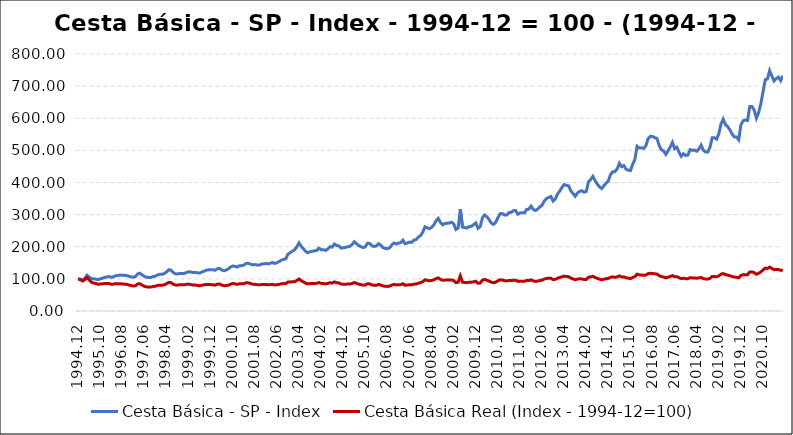
| Category | Cesta Básica - SP - Index | Cesta Básica Real (Index - 1994-12=100) |
|---|---|---|
| 1994.12 | 100 | 100 |
| 1995.01 | 99.302 | 97.642 |
| 1995.02 | 95.848 | 93.294 |
| 1995.03 | 101.418 | 97.21 |
| 1995.04 | 111.508 | 104.344 |
| 1995.05 | 105.937 | 96.554 |
| 1995.06 | 100.904 | 89.934 |
| 1995.07 | 100.149 | 87.203 |
| 1995.08 | 99.279 | 85.598 |
| 1995.09 | 97.529 | 83.265 |
| 1995.10 | 100.092 | 84.265 |
| 1995.11 | 101.853 | 84.505 |
| 1995.12 | 104.69 | 85.525 |
| 1996.01 | 105.891 | 85.362 |
| 1996.02 | 107.264 | 85.587 |
| 1996.03 | 104.839 | 83.36 |
| 1996.04 | 106.36 | 83.518 |
| 1996.05 | 110.021 | 85.351 |
| 1996.06 | 110.204 | 84.488 |
| 1996.07 | 112.091 | 84.991 |
| 1996.08 | 111.256 | 83.988 |
| 1996.09 | 110.89 | 83.587 |
| 1996.10 | 110.215 | 82.829 |
| 1996.11 | 108.167 | 81.031 |
| 1996.12 | 105.971 | 79.015 |
| 1997.01 | 105.445 | 77.705 |
| 1997.02 | 107.287 | 78.669 |
| 1997.03 | 115.671 | 84.387 |
| 1997.04 | 117.605 | 85.049 |
| 1997.05 | 111.771 | 80.5 |
| 1997.06 | 107.584 | 77.069 |
| 1997.07 | 104.896 | 74.978 |
| 1997.08 | 104.621 | 74.797 |
| 1997.09 | 104.255 | 74.49 |
| 1997.10 | 107.527 | 76.651 |
| 1997.11 | 108.453 | 77.181 |
| 1997.12 | 112.469 | 79.695 |
| 1998.01 | 114.402 | 80.494 |
| 1998.02 | 113.99 | 79.932 |
| 1998.03 | 116.644 | 81.516 |
| 1998.04 | 121.597 | 84.774 |
| 1998.05 | 128.277 | 88.987 |
| 1998.06 | 127.511 | 88.437 |
| 1998.07 | 120.201 | 83.468 |
| 1998.08 | 116.026 | 80.981 |
| 1998.09 | 114.997 | 80.44 |
| 1998.10 | 117.239 | 81.992 |
| 1998.11 | 116.404 | 81.506 |
| 1998.12 | 116.781 | 81.501 |
| 1999.01 | 119.95 | 83.13 |
| 1999.02 | 122.112 | 83.749 |
| 1999.03 | 121.574 | 82.473 |
| 1999.04 | 119.584 | 80.671 |
| 1999.05 | 120.167 | 80.822 |
| 1999.06 | 118.966 | 79.863 |
| 1999.07 | 117.856 | 78.265 |
| 1999.08 | 121.517 | 80.246 |
| 1999.09 | 123.736 | 81.459 |
| 1999.10 | 127.099 | 82.689 |
| 1999.11 | 128.014 | 82.501 |
| 1999.12 | 128.071 | 82.046 |
| 2000.01 | 128.369 | 81.729 |
| 2000.02 | 126.744 | 80.59 |
| 2000.03 | 131.698 | 83.556 |
| 2000.04 | 132.601 | 83.777 |
| 2000.05 | 127.865 | 80.777 |
| 2000.06 | 125.189 | 78.905 |
| 2000.07 | 127.465 | 79.067 |
| 2000.08 | 131.126 | 80.286 |
| 2000.09 | 136.662 | 83.483 |
| 2000.10 | 140.254 | 85.558 |
| 2000.11 | 139.11 | 84.589 |
| 2000.12 | 136.742 | 82.662 |
| 2001.01 | 141.112 | 84.82 |
| 2001.02 | 141.203 | 84.486 |
| 2001.03 | 142.713 | 85.066 |
| 2001.04 | 148.124 | 87.782 |
| 2001.05 | 148.456 | 87.62 |
| 2001.06 | 145.939 | 85.689 |
| 2001.07 | 143.766 | 83.305 |
| 2001.08 | 144.578 | 83.193 |
| 2001.09 | 142.999 | 82.055 |
| 2001.10 | 142.988 | 81.373 |
| 2001.11 | 145.596 | 82.273 |
| 2001.12 | 147.106 | 82.589 |
| 2002.01 | 147.804 | 82.552 |
| 2002.02 | 147.14 | 81.887 |
| 2002.03 | 148.582 | 82.195 |
| 2002.04 | 151.247 | 83.006 |
| 2002.05 | 147.861 | 80.978 |
| 2002.06 | 150.423 | 82.036 |
| 2002.07 | 154.015 | 83.007 |
| 2002.08 | 158.19 | 84.707 |
| 2002.09 | 160.661 | 85.415 |
| 2002.10 | 162.571 | 85.313 |
| 2002.11 | 177.008 | 90.166 |
| 2002.12 | 181.572 | 90.588 |
| 2003.01 | 186.216 | 90.861 |
| 2003.02 | 190.506 | 91.517 |
| 2003.03 | 199.714 | 94.775 |
| 2003.04 | 212.08 | 99.677 |
| 2003.05 | 201.27 | 94.022 |
| 2003.06 | 193.571 | 90.562 |
| 2003.07 | 185.484 | 86.605 |
| 2003.08 | 181.126 | 84.284 |
| 2003.09 | 184.683 | 85.274 |
| 2003.10 | 185.976 | 85.622 |
| 2003.11 | 187.074 | 85.836 |
| 2003.12 | 188.504 | 86.045 |
| 2004.01 | 195.642 | 88.629 |
| 2004.02 | 191.032 | 86.016 |
| 2004.03 | 190.986 | 85.593 |
| 2004.04 | 188.744 | 84.277 |
| 2004.05 | 192.954 | 85.719 |
| 2004.06 | 200.069 | 88.254 |
| 2004.07 | 198.982 | 86.983 |
| 2004.08 | 208.488 | 90.513 |
| 2004.09 | 204.038 | 88.29 |
| 2004.10 | 202.631 | 87.297 |
| 2004.11 | 195.676 | 83.723 |
| 2004.12 | 196.98 | 83.563 |
| 2005.01 | 197.747 | 83.404 |
| 2005.02 | 200.229 | 83.956 |
| 2005.03 | 201.178 | 83.842 |
| 2005.04 | 206.966 | 85.511 |
| 2005.05 | 215.774 | 88.715 |
| 2005.06 | 209.494 | 86.15 |
| 2005.07 | 203.866 | 83.627 |
| 2005.08 | 200.32 | 82.033 |
| 2005.09 | 197.14 | 80.449 |
| 2005.10 | 199.92 | 80.976 |
| 2005.11 | 211.245 | 85.095 |
| 2005.12 | 209.826 | 84.22 |
| 2006.01 | 202.986 | 80.997 |
| 2006.02 | 200.801 | 79.798 |
| 2006.03 | 202.791 | 80.244 |
| 2006.04 | 209.277 | 82.637 |
| 2006.05 | 204.747 | 80.767 |
| 2006.06 | 197.106 | 77.916 |
| 2006.07 | 195.035 | 76.952 |
| 2006.08 | 194.029 | 76.516 |
| 2006.09 | 196.866 | 77.472 |
| 2006.10 | 205.605 | 80.645 |
| 2006.11 | 211.954 | 82.879 |
| 2006.12 | 208.248 | 81.041 |
| 2007.01 | 211.302 | 81.869 |
| 2007.02 | 212.72 | 82.057 |
| 2007.03 | 220.613 | 84.788 |
| 2007.04 | 209.277 | 80.231 |
| 2007.05 | 211.542 | 80.873 |
| 2007.06 | 214.425 | 81.746 |
| 2007.07 | 213.887 | 81.346 |
| 2007.08 | 220.819 | 83.589 |
| 2007.09 | 222.306 | 84.001 |
| 2007.10 | 230.21 | 86.728 |
| 2007.11 | 235.049 | 88.215 |
| 2007.12 | 245.516 | 91.467 |
| 2008.01 | 262.057 | 97.105 |
| 2008.02 | 258.751 | 95.412 |
| 2008.03 | 256.166 | 94.008 |
| 2008.04 | 260.593 | 95.109 |
| 2008.05 | 267.582 | 96.894 |
| 2008.06 | 280.531 | 100.837 |
| 2008.07 | 288.412 | 103.124 |
| 2008.08 | 275.852 | 98.357 |
| 2008.09 | 268.451 | 95.47 |
| 2008.10 | 272.42 | 96.448 |
| 2008.11 | 273.004 | 96.308 |
| 2008.12 | 273.953 | 96.373 |
| 2009.01 | 276.287 | 96.729 |
| 2009.02 | 271.494 | 94.531 |
| 2009.03 | 253.832 | 88.205 |
| 2009.04 | 258.099 | 89.26 |
| 2009.05 | 317.273 | 109.211 |
| 2009.06 | 260.924 | 89.492 |
| 2009.07 | 259.86 | 88.914 |
| 2009.08 | 258.167 | 88.203 |
| 2009.09 | 262.972 | 89.629 |
| 2009.10 | 263.441 | 89.538 |
| 2009.11 | 268.806 | 90.988 |
| 2009.12 | 273.953 | 92.389 |
| 2010.01 | 257.401 | 86.161 |
| 2010.02 | 262.686 | 87.249 |
| 2010.03 | 290.254 | 95.907 |
| 2010.04 | 299.005 | 98.238 |
| 2010.05 | 293.194 | 95.917 |
| 2010.06 | 284.9 | 93.204 |
| 2010.07 | 273.827 | 89.572 |
| 2010.08 | 269.561 | 88.141 |
| 2010.09 | 275.772 | 89.768 |
| 2010.10 | 290.311 | 93.798 |
| 2010.11 | 302.688 | 96.991 |
| 2010.12 | 303.306 | 96.581 |
| 2011.01 | 298.845 | 94.377 |
| 2011.02 | 298.765 | 93.603 |
| 2011.03 | 306.086 | 95.145 |
| 2011.04 | 307.161 | 94.75 |
| 2011.05 | 312.263 | 95.873 |
| 2011.06 | 312.835 | 95.904 |
| 2011.07 | 301.281 | 92.215 |
| 2011.08 | 305.136 | 93.051 |
| 2011.09 | 305.639 | 92.713 |
| 2011.10 | 305.388 | 92.24 |
| 2011.11 | 316.072 | 94.973 |
| 2011.12 | 317.113 | 94.812 |
| 2012.01 | 326.63 | 97.113 |
| 2012.02 | 316.335 | 93.631 |
| 2012.03 | 312.571 | 92.323 |
| 2012.04 | 317.17 | 93.086 |
| 2012.05 | 324.514 | 94.899 |
| 2012.06 | 329.021 | 96.141 |
| 2012.07 | 342.473 | 99.643 |
| 2012.08 | 350.057 | 101.434 |
| 2012.09 | 353.558 | 101.867 |
| 2012.10 | 356.383 | 102.079 |
| 2012.11 | 342.324 | 97.467 |
| 2012.12 | 348.776 | 98.526 |
| 2013.01 | 364.219 | 102.011 |
| 2013.02 | 373.587 | 104.011 |
| 2013.03 | 384.649 | 106.59 |
| 2013.04 | 393.846 | 108.541 |
| 2013.05 | 391.272 | 107.434 |
| 2013.06 | 389.453 | 106.658 |
| 2013.07 | 374.56 | 102.548 |
| 2013.08 | 365.66 | 99.872 |
| 2013.09 | 356.978 | 97.16 |
| 2013.10 | 367.353 | 99.418 |
| 2013.11 | 372.409 | 100.245 |
| 2013.12 | 374.331 | 99.843 |
| 2014.01 | 370.018 | 98.153 |
| 2014.02 | 372.169 | 98.047 |
| 2014.03 | 402.036 | 104.95 |
| 2014.04 | 409.346 | 106.147 |
| 2014.05 | 419.286 | 108.227 |
| 2014.06 | 405.662 | 104.293 |
| 2014.07 | 395.127 | 101.574 |
| 2014.08 | 386.41 | 99.086 |
| 2014.09 | 381.057 | 97.159 |
| 2014.10 | 390.117 | 99.053 |
| 2014.11 | 398.032 | 100.55 |
| 2014.12 | 405.159 | 101.559 |
| 2015.01 | 424.64 | 105.138 |
| 2015.02 | 433.379 | 106.008 |
| 2015.03 | 433.94 | 104.763 |
| 2015.04 | 442.748 | 106.136 |
| 2015.05 | 459.906 | 109.439 |
| 2015.06 | 449.291 | 106.075 |
| 2015.07 | 452.791 | 106.243 |
| 2015.08 | 441.592 | 103.388 |
| 2015.09 | 438.355 | 102.078 |
| 2015.10 | 437.12 | 100.963 |
| 2015.11 | 456.658 | 104.421 |
| 2015.12 | 471.425 | 106.773 |
| 2016.01 | 512.823 | 114.692 |
| 2016.02 | 507.207 | 112.424 |
| 2016.03 | 508.019 | 112.122 |
| 2016.04 | 506.086 | 111.018 |
| 2016.05 | 514.413 | 111.972 |
| 2016.06 | 536.513 | 116.375 |
| 2016.07 | 543.663 | 117.316 |
| 2016.08 | 543.48 | 116.762 |
| 2016.09 | 539.43 | 115.8 |
| 2016.10 | 537.12 | 115.005 |
| 2016.11 | 515.202 | 110.114 |
| 2016.12 | 502.048 | 106.981 |
| 2017.01 | 498.616 | 105.848 |
| 2017.02 | 487.554 | 103.159 |
| 2017.03 | 497.987 | 105.104 |
| 2017.04 | 510.501 | 107.594 |
| 2017.05 | 524.971 | 110.302 |
| 2017.06 | 505.159 | 106.384 |
| 2017.07 | 509.986 | 107.144 |
| 2017.08 | 493.777 | 103.541 |
| 2017.09 | 481.606 | 100.828 |
| 2017.10 | 489.739 | 102.102 |
| 2017.11 | 484.134 | 100.651 |
| 2017.12 | 485.427 | 100.478 |
| 2018.01 | 502.402 | 103.691 |
| 2018.02 | 500.263 | 102.92 |
| 2018.03 | 500.846 | 102.948 |
| 2018.04 | 497.369 | 102.008 |
| 2018.05 | 504.644 | 103.088 |
| 2018.06 | 516.621 | 104.222 |
| 2018.07 | 500.366 | 100.61 |
| 2018.08 | 495.093 | 99.64 |
| 2018.09 | 495.116 | 99.168 |
| 2018.10 | 510.204 | 101.733 |
| 2018.11 | 539.202 | 107.741 |
| 2018.12 | 539.282 | 107.596 |
| 2019.01 | 534.946 | 106.39 |
| 2019.02 | 551.819 | 109.276 |
| 2019.03 | 582.372 | 114.468 |
| 2019.04 | 597.175 | 116.712 |
| 2019.05 | 580.039 | 113.216 |
| 2019.06 | 573.873 | 112.001 |
| 2019.07 | 564.127 | 109.89 |
| 2019.08 | 550.721 | 107.161 |
| 2019.09 | 542.038 | 105.514 |
| 2019.10 | 541.741 | 105.35 |
| 2019.11 | 532.841 | 103.094 |
| 2019.12 | 579.387 | 110.825 |
| 2020.01 | 591.981 | 112.997 |
| 2020.02 | 594.555 | 113.205 |
| 2020.03 | 593.114 | 112.852 |
| 2020.04 | 636.296 | 121.444 |
| 2020.05 | 636.422 | 121.932 |
| 2020.06 | 625.749 | 119.576 |
| 2020.07 | 600.252 | 114.292 |
| 2020.08 | 617.65 | 117.324 |
| 2020.09 | 644.418 | 121.63 |
| 2020.10 | 681.617 | 127.554 |
| 2020.11 | 719.721 | 133.496 |
| 2020.12 | 722.329 | 132.195 |
| 2021.01 | 748.284 | 136.604 |
| 2021.02 | 731.492 | 132.4 |
| 2021.03 | 716.083 | 128.416 |
| 2021.04 | 723.644 | 129.371 |
| 2021.05 | 727.98 | 129.075 |
| 2021.06 | 716.953 | 126.45 |
| 2021.07 | 732.681 | 127.995 |